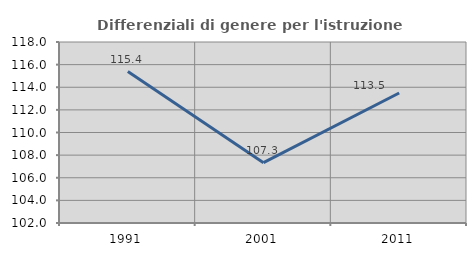
| Category | Differenziali di genere per l'istruzione superiore |
|---|---|
| 1991.0 | 115.391 |
| 2001.0 | 107.334 |
| 2011.0 | 113.495 |